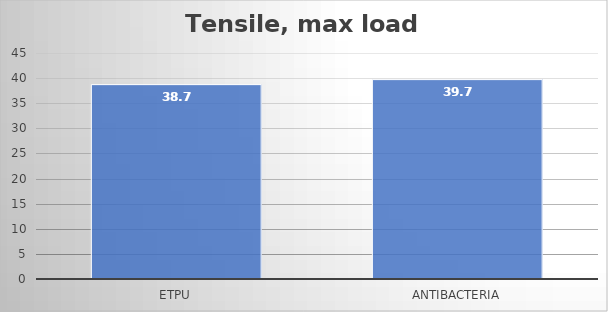
| Category | Average |
|---|---|
| eTPU | 38.7 |
| Antibacteria | 39.7 |